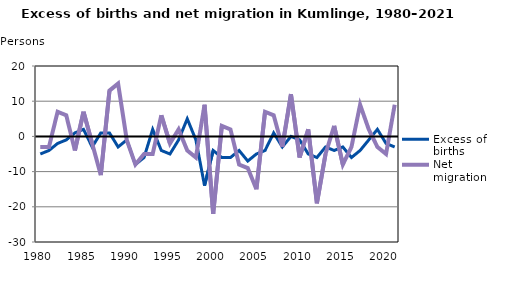
| Category | Excess of births | Net migration |
|---|---|---|
| 1980.0 | -5 | -3 |
| 1981.0 | -4 | -3 |
| 1982.0 | -2 | 7 |
| 1983.0 | -1 | 6 |
| 1984.0 | 1 | -4 |
| 1985.0 | 2 | 7 |
| 1986.0 | -3 | -2 |
| 1987.0 | 1 | -11 |
| 1988.0 | 1 | 13 |
| 1989.0 | -3 | 15 |
| 1990.0 | -1 | -1 |
| 1991.0 | -8 | -8 |
| 1992.0 | -6 | -5 |
| 1993.0 | 2 | -5 |
| 1994.0 | -4 | 6 |
| 1995.0 | -5 | -2 |
| 1996.0 | -1 | 2 |
| 1997.0 | 5 | -4 |
| 1998.0 | -1 | -6 |
| 1999.0 | -14 | 9 |
| 2000.0 | -4 | -22 |
| 2001.0 | -6 | 3 |
| 2002.0 | -6 | 2 |
| 2003.0 | -4 | -8 |
| 2004.0 | -7 | -9 |
| 2005.0 | -5 | -15 |
| 2006.0 | -4 | 7 |
| 2007.0 | 1 | 6 |
| 2008.0 | -3 | -3 |
| 2009.0 | 0 | 12 |
| 2010.0 | -1 | -6 |
| 2011.0 | -5 | 2 |
| 2012.0 | -6 | -19 |
| 2013.0 | -3 | -5 |
| 2014.0 | -4 | 3 |
| 2015.0 | -3 | -8 |
| 2016.0 | -6 | -3 |
| 2017.0 | -4 | 9 |
| 2018.0 | -1 | 2 |
| 2019.0 | 2 | -3 |
| 2020.0 | -2 | -5 |
| 2021.0 | -3 | 9 |